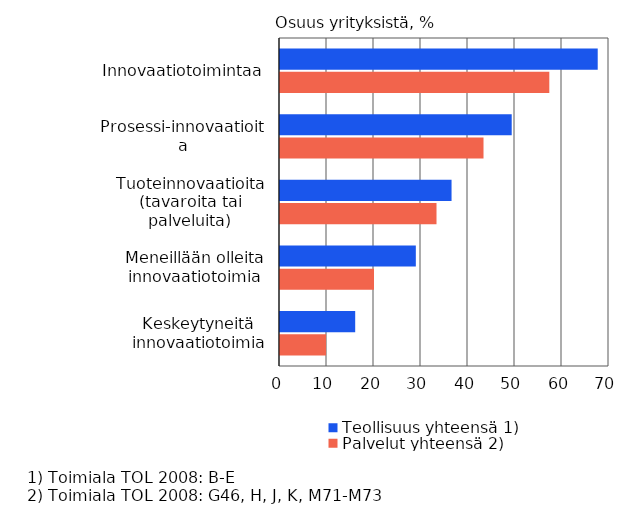
| Category | Teollisuus yhteensä 1) | Palvelut yhteensä 2) |
|---|---|---|
| Innovaatiotoimintaa | 67.6 | 57.3 |
| Prosessi-innovaatioita | 49.3 | 43.3 |
| Tuoteinnovaatioita (tavaroita tai palveluita) | 36.5 | 33.3 |
| Meneillään olleita innovaatiotoimia | 28.9 | 20 |
| Keskeytyneitä innovaatiotoimia | 16 | 9.8 |